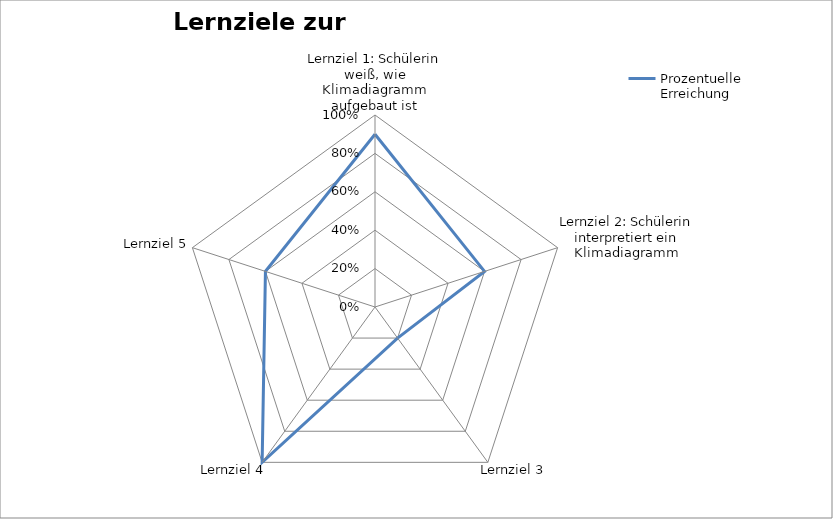
| Category | Prozentuelle 
Erreichung |
|---|---|
| Lernziel 1: Schülerin weiß, wie Klimadiagramm aufgebaut ist | 0.9 |
| Lernziel 2: Schülerin interpretiert ein Klimadiagramm | 0.6 |
| Lernziel 3 | 0.2 |
| Lernziel 4 | 1 |
| Lernziel 5 | 0.6 |